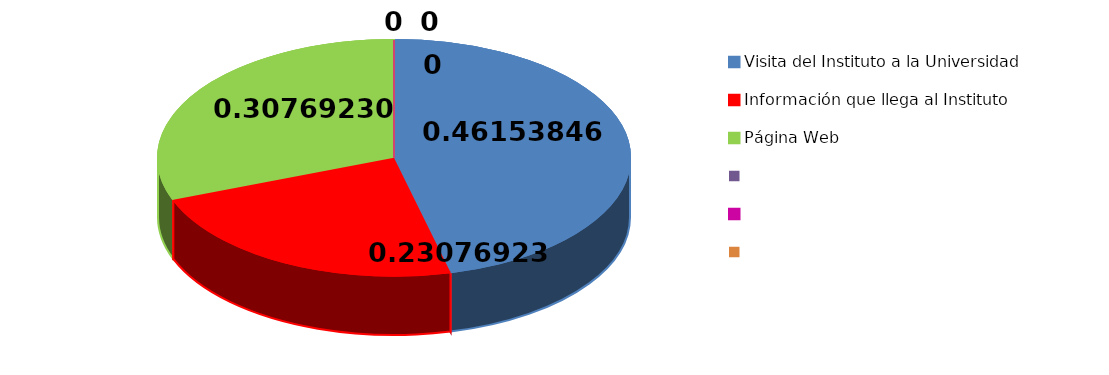
| Category | Series 0 |
|---|---|
| Visita del Instituto a la Universidad | 6 |
| Información que llega al Instituto | 3 |
| Página Web | 4 |